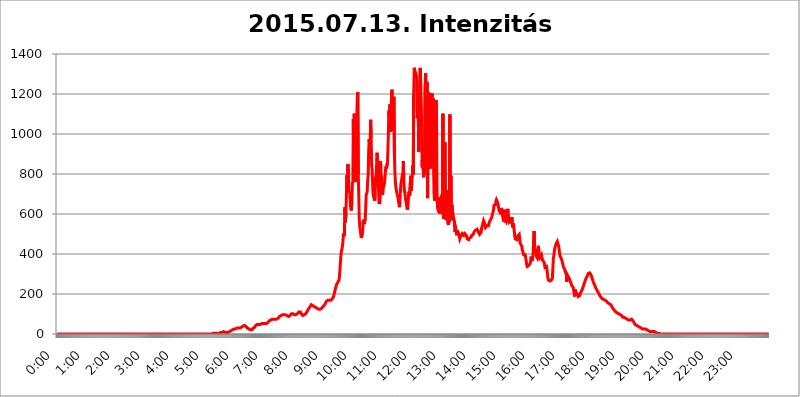
| Category | 2015.07.13. Intenzitás [W/m^2] |
|---|---|
| 0.0 | 0 |
| 0.0006944444444444445 | 0 |
| 0.001388888888888889 | 0 |
| 0.0020833333333333333 | 0 |
| 0.002777777777777778 | 0 |
| 0.003472222222222222 | 0 |
| 0.004166666666666667 | 0 |
| 0.004861111111111111 | 0 |
| 0.005555555555555556 | 0 |
| 0.0062499999999999995 | 0 |
| 0.006944444444444444 | 0 |
| 0.007638888888888889 | 0 |
| 0.008333333333333333 | 0 |
| 0.009027777777777779 | 0 |
| 0.009722222222222222 | 0 |
| 0.010416666666666666 | 0 |
| 0.011111111111111112 | 0 |
| 0.011805555555555555 | 0 |
| 0.012499999999999999 | 0 |
| 0.013194444444444444 | 0 |
| 0.013888888888888888 | 0 |
| 0.014583333333333332 | 0 |
| 0.015277777777777777 | 0 |
| 0.015972222222222224 | 0 |
| 0.016666666666666666 | 0 |
| 0.017361111111111112 | 0 |
| 0.018055555555555557 | 0 |
| 0.01875 | 0 |
| 0.019444444444444445 | 0 |
| 0.02013888888888889 | 0 |
| 0.020833333333333332 | 0 |
| 0.02152777777777778 | 0 |
| 0.022222222222222223 | 0 |
| 0.02291666666666667 | 0 |
| 0.02361111111111111 | 0 |
| 0.024305555555555556 | 0 |
| 0.024999999999999998 | 0 |
| 0.025694444444444447 | 0 |
| 0.02638888888888889 | 0 |
| 0.027083333333333334 | 0 |
| 0.027777777777777776 | 0 |
| 0.02847222222222222 | 0 |
| 0.029166666666666664 | 0 |
| 0.029861111111111113 | 0 |
| 0.030555555555555555 | 0 |
| 0.03125 | 0 |
| 0.03194444444444445 | 0 |
| 0.03263888888888889 | 0 |
| 0.03333333333333333 | 0 |
| 0.034027777777777775 | 0 |
| 0.034722222222222224 | 0 |
| 0.035416666666666666 | 0 |
| 0.036111111111111115 | 0 |
| 0.03680555555555556 | 0 |
| 0.0375 | 0 |
| 0.03819444444444444 | 0 |
| 0.03888888888888889 | 0 |
| 0.03958333333333333 | 0 |
| 0.04027777777777778 | 0 |
| 0.04097222222222222 | 0 |
| 0.041666666666666664 | 0 |
| 0.042361111111111106 | 0 |
| 0.04305555555555556 | 0 |
| 0.043750000000000004 | 0 |
| 0.044444444444444446 | 0 |
| 0.04513888888888889 | 0 |
| 0.04583333333333334 | 0 |
| 0.04652777777777778 | 0 |
| 0.04722222222222222 | 0 |
| 0.04791666666666666 | 0 |
| 0.04861111111111111 | 0 |
| 0.049305555555555554 | 0 |
| 0.049999999999999996 | 0 |
| 0.05069444444444445 | 0 |
| 0.051388888888888894 | 0 |
| 0.052083333333333336 | 0 |
| 0.05277777777777778 | 0 |
| 0.05347222222222222 | 0 |
| 0.05416666666666667 | 0 |
| 0.05486111111111111 | 0 |
| 0.05555555555555555 | 0 |
| 0.05625 | 0 |
| 0.05694444444444444 | 0 |
| 0.057638888888888885 | 0 |
| 0.05833333333333333 | 0 |
| 0.05902777777777778 | 0 |
| 0.059722222222222225 | 0 |
| 0.06041666666666667 | 0 |
| 0.061111111111111116 | 0 |
| 0.06180555555555556 | 0 |
| 0.0625 | 0 |
| 0.06319444444444444 | 0 |
| 0.06388888888888888 | 0 |
| 0.06458333333333334 | 0 |
| 0.06527777777777778 | 0 |
| 0.06597222222222222 | 0 |
| 0.06666666666666667 | 0 |
| 0.06736111111111111 | 0 |
| 0.06805555555555555 | 0 |
| 0.06874999999999999 | 0 |
| 0.06944444444444443 | 0 |
| 0.07013888888888889 | 0 |
| 0.07083333333333333 | 0 |
| 0.07152777777777779 | 0 |
| 0.07222222222222223 | 0 |
| 0.07291666666666667 | 0 |
| 0.07361111111111111 | 0 |
| 0.07430555555555556 | 0 |
| 0.075 | 0 |
| 0.07569444444444444 | 0 |
| 0.0763888888888889 | 0 |
| 0.07708333333333334 | 0 |
| 0.07777777777777778 | 0 |
| 0.07847222222222222 | 0 |
| 0.07916666666666666 | 0 |
| 0.0798611111111111 | 0 |
| 0.08055555555555556 | 0 |
| 0.08125 | 0 |
| 0.08194444444444444 | 0 |
| 0.08263888888888889 | 0 |
| 0.08333333333333333 | 0 |
| 0.08402777777777777 | 0 |
| 0.08472222222222221 | 0 |
| 0.08541666666666665 | 0 |
| 0.08611111111111112 | 0 |
| 0.08680555555555557 | 0 |
| 0.08750000000000001 | 0 |
| 0.08819444444444445 | 0 |
| 0.08888888888888889 | 0 |
| 0.08958333333333333 | 0 |
| 0.09027777777777778 | 0 |
| 0.09097222222222222 | 0 |
| 0.09166666666666667 | 0 |
| 0.09236111111111112 | 0 |
| 0.09305555555555556 | 0 |
| 0.09375 | 0 |
| 0.09444444444444444 | 0 |
| 0.09513888888888888 | 0 |
| 0.09583333333333333 | 0 |
| 0.09652777777777777 | 0 |
| 0.09722222222222222 | 0 |
| 0.09791666666666667 | 0 |
| 0.09861111111111111 | 0 |
| 0.09930555555555555 | 0 |
| 0.09999999999999999 | 0 |
| 0.10069444444444443 | 0 |
| 0.1013888888888889 | 0 |
| 0.10208333333333335 | 0 |
| 0.10277777777777779 | 0 |
| 0.10347222222222223 | 0 |
| 0.10416666666666667 | 0 |
| 0.10486111111111111 | 0 |
| 0.10555555555555556 | 0 |
| 0.10625 | 0 |
| 0.10694444444444444 | 0 |
| 0.1076388888888889 | 0 |
| 0.10833333333333334 | 0 |
| 0.10902777777777778 | 0 |
| 0.10972222222222222 | 0 |
| 0.1111111111111111 | 0 |
| 0.11180555555555556 | 0 |
| 0.11180555555555556 | 0 |
| 0.1125 | 0 |
| 0.11319444444444444 | 0 |
| 0.11388888888888889 | 0 |
| 0.11458333333333333 | 0 |
| 0.11527777777777777 | 0 |
| 0.11597222222222221 | 0 |
| 0.11666666666666665 | 0 |
| 0.1173611111111111 | 0 |
| 0.11805555555555557 | 0 |
| 0.11944444444444445 | 0 |
| 0.12013888888888889 | 0 |
| 0.12083333333333333 | 0 |
| 0.12152777777777778 | 0 |
| 0.12222222222222223 | 0 |
| 0.12291666666666667 | 0 |
| 0.12291666666666667 | 0 |
| 0.12361111111111112 | 0 |
| 0.12430555555555556 | 0 |
| 0.125 | 0 |
| 0.12569444444444444 | 0 |
| 0.12638888888888888 | 0 |
| 0.12708333333333333 | 0 |
| 0.16875 | 0 |
| 0.12847222222222224 | 0 |
| 0.12916666666666668 | 0 |
| 0.12986111111111112 | 0 |
| 0.13055555555555556 | 0 |
| 0.13125 | 0 |
| 0.13194444444444445 | 0 |
| 0.1326388888888889 | 0 |
| 0.13333333333333333 | 0 |
| 0.13402777777777777 | 0 |
| 0.13402777777777777 | 0 |
| 0.13472222222222222 | 0 |
| 0.13541666666666666 | 0 |
| 0.1361111111111111 | 0 |
| 0.13749999999999998 | 0 |
| 0.13819444444444443 | 0 |
| 0.1388888888888889 | 0 |
| 0.13958333333333334 | 0 |
| 0.14027777777777778 | 0 |
| 0.14097222222222222 | 0 |
| 0.14166666666666666 | 0 |
| 0.1423611111111111 | 0 |
| 0.14305555555555557 | 0 |
| 0.14375000000000002 | 0 |
| 0.14444444444444446 | 0 |
| 0.1451388888888889 | 0 |
| 0.1451388888888889 | 0 |
| 0.14652777777777778 | 0 |
| 0.14722222222222223 | 0 |
| 0.14791666666666667 | 0 |
| 0.1486111111111111 | 0 |
| 0.14930555555555555 | 0 |
| 0.15 | 0 |
| 0.15069444444444444 | 0 |
| 0.15138888888888888 | 0 |
| 0.15208333333333332 | 0 |
| 0.15277777777777776 | 0 |
| 0.15347222222222223 | 0 |
| 0.15416666666666667 | 0 |
| 0.15486111111111112 | 0 |
| 0.15555555555555556 | 0 |
| 0.15625 | 0 |
| 0.15694444444444444 | 0 |
| 0.15763888888888888 | 0 |
| 0.15833333333333333 | 0 |
| 0.15902777777777777 | 0 |
| 0.15972222222222224 | 0 |
| 0.16041666666666668 | 0 |
| 0.16111111111111112 | 0 |
| 0.16180555555555556 | 0 |
| 0.1625 | 0 |
| 0.16319444444444445 | 0 |
| 0.1638888888888889 | 0 |
| 0.16458333333333333 | 0 |
| 0.16527777777777777 | 0 |
| 0.16597222222222222 | 0 |
| 0.16666666666666666 | 0 |
| 0.1673611111111111 | 0 |
| 0.16805555555555554 | 0 |
| 0.16874999999999998 | 0 |
| 0.16944444444444443 | 0 |
| 0.17013888888888887 | 0 |
| 0.1708333333333333 | 0 |
| 0.17152777777777775 | 0 |
| 0.17222222222222225 | 0 |
| 0.1729166666666667 | 0 |
| 0.17361111111111113 | 0 |
| 0.17430555555555557 | 0 |
| 0.17500000000000002 | 0 |
| 0.17569444444444446 | 0 |
| 0.1763888888888889 | 0 |
| 0.17708333333333334 | 0 |
| 0.17777777777777778 | 0 |
| 0.17847222222222223 | 0 |
| 0.17916666666666667 | 0 |
| 0.1798611111111111 | 0 |
| 0.18055555555555555 | 0 |
| 0.18125 | 0 |
| 0.18194444444444444 | 0 |
| 0.1826388888888889 | 0 |
| 0.18333333333333335 | 0 |
| 0.1840277777777778 | 0 |
| 0.18472222222222223 | 0 |
| 0.18541666666666667 | 0 |
| 0.18611111111111112 | 0 |
| 0.18680555555555556 | 0 |
| 0.1875 | 0 |
| 0.18819444444444444 | 0 |
| 0.18888888888888888 | 0 |
| 0.18958333333333333 | 0 |
| 0.19027777777777777 | 0 |
| 0.1909722222222222 | 0 |
| 0.19166666666666665 | 0 |
| 0.19236111111111112 | 0 |
| 0.19305555555555554 | 0 |
| 0.19375 | 0 |
| 0.19444444444444445 | 0 |
| 0.1951388888888889 | 0 |
| 0.19583333333333333 | 0 |
| 0.19652777777777777 | 0 |
| 0.19722222222222222 | 0 |
| 0.19791666666666666 | 0 |
| 0.1986111111111111 | 0 |
| 0.19930555555555554 | 0 |
| 0.19999999999999998 | 0 |
| 0.20069444444444443 | 0 |
| 0.20138888888888887 | 0 |
| 0.2020833333333333 | 0 |
| 0.2027777777777778 | 0 |
| 0.2034722222222222 | 0 |
| 0.2041666666666667 | 0 |
| 0.20486111111111113 | 0 |
| 0.20555555555555557 | 0 |
| 0.20625000000000002 | 0 |
| 0.20694444444444446 | 0 |
| 0.2076388888888889 | 0 |
| 0.20833333333333334 | 0 |
| 0.20902777777777778 | 0 |
| 0.20972222222222223 | 0 |
| 0.21041666666666667 | 0 |
| 0.2111111111111111 | 0 |
| 0.21180555555555555 | 0 |
| 0.2125 | 0 |
| 0.21319444444444444 | 0 |
| 0.2138888888888889 | 0 |
| 0.21458333333333335 | 0 |
| 0.2152777777777778 | 0 |
| 0.21597222222222223 | 0 |
| 0.21666666666666667 | 0 |
| 0.21736111111111112 | 0 |
| 0.21805555555555556 | 0 |
| 0.21875 | 3.525 |
| 0.21944444444444444 | 3.525 |
| 0.22013888888888888 | 3.525 |
| 0.22083333333333333 | 3.525 |
| 0.22152777777777777 | 3.525 |
| 0.2222222222222222 | 3.525 |
| 0.22291666666666665 | 3.525 |
| 0.2236111111111111 | 3.525 |
| 0.22430555555555556 | 3.525 |
| 0.225 | 3.525 |
| 0.22569444444444445 | 3.525 |
| 0.2263888888888889 | 3.525 |
| 0.22708333333333333 | 3.525 |
| 0.22777777777777777 | 3.525 |
| 0.22847222222222222 | 3.525 |
| 0.22916666666666666 | 7.887 |
| 0.2298611111111111 | 7.887 |
| 0.23055555555555554 | 7.887 |
| 0.23124999999999998 | 7.887 |
| 0.23194444444444443 | 12.257 |
| 0.23263888888888887 | 12.257 |
| 0.2333333333333333 | 12.257 |
| 0.2340277777777778 | 12.257 |
| 0.2347222222222222 | 12.257 |
| 0.2354166666666667 | 7.887 |
| 0.23611111111111113 | 7.887 |
| 0.23680555555555557 | 7.887 |
| 0.23750000000000002 | 7.887 |
| 0.23819444444444446 | 7.887 |
| 0.2388888888888889 | 7.887 |
| 0.23958333333333334 | 7.887 |
| 0.24027777777777778 | 12.257 |
| 0.24097222222222223 | 12.257 |
| 0.24166666666666667 | 12.257 |
| 0.2423611111111111 | 12.257 |
| 0.24305555555555555 | 16.636 |
| 0.24375 | 16.636 |
| 0.24444444444444446 | 16.636 |
| 0.24513888888888888 | 21.024 |
| 0.24583333333333335 | 21.024 |
| 0.2465277777777778 | 21.024 |
| 0.24722222222222223 | 21.024 |
| 0.24791666666666667 | 25.419 |
| 0.24861111111111112 | 25.419 |
| 0.24930555555555556 | 25.419 |
| 0.25 | 25.419 |
| 0.25069444444444444 | 29.823 |
| 0.2513888888888889 | 29.823 |
| 0.2520833333333333 | 29.823 |
| 0.25277777777777777 | 29.823 |
| 0.2534722222222222 | 29.823 |
| 0.25416666666666665 | 29.823 |
| 0.2548611111111111 | 29.823 |
| 0.2555555555555556 | 29.823 |
| 0.25625000000000003 | 29.823 |
| 0.2569444444444445 | 29.823 |
| 0.2576388888888889 | 34.234 |
| 0.25833333333333336 | 34.234 |
| 0.2590277777777778 | 34.234 |
| 0.25972222222222224 | 38.653 |
| 0.2604166666666667 | 38.653 |
| 0.2611111111111111 | 43.079 |
| 0.26180555555555557 | 43.079 |
| 0.2625 | 43.079 |
| 0.26319444444444445 | 43.079 |
| 0.2638888888888889 | 38.653 |
| 0.26458333333333334 | 38.653 |
| 0.2652777777777778 | 38.653 |
| 0.2659722222222222 | 34.234 |
| 0.26666666666666666 | 29.823 |
| 0.2673611111111111 | 29.823 |
| 0.26805555555555555 | 25.419 |
| 0.26875 | 25.419 |
| 0.26944444444444443 | 21.024 |
| 0.2701388888888889 | 21.024 |
| 0.2708333333333333 | 21.024 |
| 0.27152777777777776 | 21.024 |
| 0.2722222222222222 | 21.024 |
| 0.27291666666666664 | 21.024 |
| 0.2736111111111111 | 21.024 |
| 0.2743055555555555 | 25.419 |
| 0.27499999999999997 | 29.823 |
| 0.27569444444444446 | 29.823 |
| 0.27638888888888885 | 34.234 |
| 0.27708333333333335 | 34.234 |
| 0.2777777777777778 | 38.653 |
| 0.27847222222222223 | 43.079 |
| 0.2791666666666667 | 43.079 |
| 0.2798611111111111 | 43.079 |
| 0.28055555555555556 | 47.511 |
| 0.28125 | 47.511 |
| 0.28194444444444444 | 47.511 |
| 0.2826388888888889 | 47.511 |
| 0.2833333333333333 | 47.511 |
| 0.28402777777777777 | 47.511 |
| 0.2847222222222222 | 47.511 |
| 0.28541666666666665 | 47.511 |
| 0.28611111111111115 | 51.951 |
| 0.28680555555555554 | 51.951 |
| 0.28750000000000003 | 51.951 |
| 0.2881944444444445 | 51.951 |
| 0.2888888888888889 | 51.951 |
| 0.28958333333333336 | 51.951 |
| 0.2902777777777778 | 47.511 |
| 0.29097222222222224 | 51.951 |
| 0.2916666666666667 | 47.511 |
| 0.2923611111111111 | 47.511 |
| 0.29305555555555557 | 51.951 |
| 0.29375 | 51.951 |
| 0.29444444444444445 | 56.398 |
| 0.2951388888888889 | 56.398 |
| 0.29583333333333334 | 60.85 |
| 0.2965277777777778 | 60.85 |
| 0.2972222222222222 | 65.31 |
| 0.29791666666666666 | 65.31 |
| 0.2986111111111111 | 65.31 |
| 0.29930555555555555 | 69.775 |
| 0.3 | 69.775 |
| 0.30069444444444443 | 69.775 |
| 0.3013888888888889 | 74.246 |
| 0.3020833333333333 | 74.246 |
| 0.30277777777777776 | 74.246 |
| 0.3034722222222222 | 74.246 |
| 0.30416666666666664 | 74.246 |
| 0.3048611111111111 | 74.246 |
| 0.3055555555555555 | 74.246 |
| 0.30624999999999997 | 74.246 |
| 0.3069444444444444 | 74.246 |
| 0.3076388888888889 | 74.246 |
| 0.30833333333333335 | 74.246 |
| 0.3090277777777778 | 74.246 |
| 0.30972222222222223 | 78.722 |
| 0.3104166666666667 | 78.722 |
| 0.3111111111111111 | 83.205 |
| 0.31180555555555556 | 87.692 |
| 0.3125 | 87.692 |
| 0.31319444444444444 | 92.184 |
| 0.3138888888888889 | 92.184 |
| 0.3145833333333333 | 96.682 |
| 0.31527777777777777 | 96.682 |
| 0.3159722222222222 | 96.682 |
| 0.31666666666666665 | 96.682 |
| 0.31736111111111115 | 96.682 |
| 0.31805555555555554 | 96.682 |
| 0.31875000000000003 | 96.682 |
| 0.3194444444444445 | 96.682 |
| 0.3201388888888889 | 96.682 |
| 0.32083333333333336 | 96.682 |
| 0.3215277777777778 | 92.184 |
| 0.32222222222222224 | 92.184 |
| 0.3229166666666667 | 92.184 |
| 0.3236111111111111 | 87.692 |
| 0.32430555555555557 | 87.692 |
| 0.325 | 87.692 |
| 0.32569444444444445 | 92.184 |
| 0.3263888888888889 | 92.184 |
| 0.32708333333333334 | 96.682 |
| 0.3277777777777778 | 96.682 |
| 0.3284722222222222 | 101.184 |
| 0.32916666666666666 | 101.184 |
| 0.3298611111111111 | 101.184 |
| 0.33055555555555555 | 101.184 |
| 0.33125 | 101.184 |
| 0.33194444444444443 | 101.184 |
| 0.3326388888888889 | 96.682 |
| 0.3333333333333333 | 96.682 |
| 0.3340277777777778 | 96.682 |
| 0.3347222222222222 | 96.682 |
| 0.3354166666666667 | 96.682 |
| 0.3361111111111111 | 101.184 |
| 0.3368055555555556 | 101.184 |
| 0.33749999999999997 | 105.69 |
| 0.33819444444444446 | 105.69 |
| 0.33888888888888885 | 110.201 |
| 0.33958333333333335 | 110.201 |
| 0.34027777777777773 | 110.201 |
| 0.34097222222222223 | 110.201 |
| 0.3416666666666666 | 105.69 |
| 0.3423611111111111 | 101.184 |
| 0.3430555555555555 | 96.682 |
| 0.34375 | 96.682 |
| 0.3444444444444445 | 92.184 |
| 0.3451388888888889 | 92.184 |
| 0.3458333333333334 | 92.184 |
| 0.34652777777777777 | 96.682 |
| 0.34722222222222227 | 96.682 |
| 0.34791666666666665 | 96.682 |
| 0.34861111111111115 | 101.184 |
| 0.34930555555555554 | 101.184 |
| 0.35000000000000003 | 110.201 |
| 0.3506944444444444 | 110.201 |
| 0.3513888888888889 | 119.235 |
| 0.3520833333333333 | 123.758 |
| 0.3527777777777778 | 128.284 |
| 0.3534722222222222 | 128.284 |
| 0.3541666666666667 | 132.814 |
| 0.3548611111111111 | 137.347 |
| 0.35555555555555557 | 141.884 |
| 0.35625 | 146.423 |
| 0.35694444444444445 | 150.964 |
| 0.3576388888888889 | 146.423 |
| 0.35833333333333334 | 141.884 |
| 0.3590277777777778 | 137.347 |
| 0.3597222222222222 | 137.347 |
| 0.36041666666666666 | 137.347 |
| 0.3611111111111111 | 137.347 |
| 0.36180555555555555 | 137.347 |
| 0.3625 | 132.814 |
| 0.36319444444444443 | 132.814 |
| 0.3638888888888889 | 128.284 |
| 0.3645833333333333 | 128.284 |
| 0.3652777777777778 | 123.758 |
| 0.3659722222222222 | 123.758 |
| 0.3666666666666667 | 123.758 |
| 0.3673611111111111 | 123.758 |
| 0.3680555555555556 | 123.758 |
| 0.36874999999999997 | 123.758 |
| 0.36944444444444446 | 123.758 |
| 0.37013888888888885 | 128.284 |
| 0.37083333333333335 | 128.284 |
| 0.37152777777777773 | 128.284 |
| 0.37222222222222223 | 132.814 |
| 0.3729166666666666 | 137.347 |
| 0.3736111111111111 | 137.347 |
| 0.3743055555555555 | 141.884 |
| 0.375 | 146.423 |
| 0.3756944444444445 | 150.964 |
| 0.3763888888888889 | 155.509 |
| 0.3770833333333334 | 160.056 |
| 0.37777777777777777 | 164.605 |
| 0.37847222222222227 | 164.605 |
| 0.37916666666666665 | 164.605 |
| 0.37986111111111115 | 169.156 |
| 0.38055555555555554 | 169.156 |
| 0.38125000000000003 | 169.156 |
| 0.3819444444444444 | 169.156 |
| 0.3826388888888889 | 169.156 |
| 0.3833333333333333 | 169.156 |
| 0.3840277777777778 | 169.156 |
| 0.3847222222222222 | 173.709 |
| 0.3854166666666667 | 173.709 |
| 0.3861111111111111 | 178.264 |
| 0.38680555555555557 | 182.82 |
| 0.3875 | 187.378 |
| 0.38819444444444445 | 196.497 |
| 0.3888888888888889 | 205.62 |
| 0.38958333333333334 | 219.309 |
| 0.3902777777777778 | 228.436 |
| 0.3909722222222222 | 237.564 |
| 0.39166666666666666 | 246.689 |
| 0.3923611111111111 | 251.251 |
| 0.39305555555555555 | 255.813 |
| 0.39375 | 260.373 |
| 0.39444444444444443 | 260.373 |
| 0.3951388888888889 | 269.49 |
| 0.3958333333333333 | 287.709 |
| 0.3965277777777778 | 324.052 |
| 0.3972222222222222 | 360.221 |
| 0.3979166666666667 | 396.164 |
| 0.3986111111111111 | 414.035 |
| 0.3993055555555556 | 422.943 |
| 0.39999999999999997 | 440.702 |
| 0.40069444444444446 | 462.786 |
| 0.40138888888888885 | 502.192 |
| 0.40208333333333335 | 489.108 |
| 0.40277777777777773 | 506.542 |
| 0.40347222222222223 | 634.105 |
| 0.4041666666666666 | 558.261 |
| 0.4048611111111111 | 604.864 |
| 0.4055555555555555 | 691.608 |
| 0.40625 | 795.074 |
| 0.4069444444444445 | 723.889 |
| 0.4076388888888889 | 849.199 |
| 0.4083333333333334 | 798.974 |
| 0.40902777777777777 | 723.889 |
| 0.40972222222222227 | 711.832 |
| 0.41041666666666665 | 703.762 |
| 0.41111111111111115 | 646.537 |
| 0.41180555555555554 | 625.784 |
| 0.41250000000000003 | 617.436 |
| 0.4131944444444444 | 658.909 |
| 0.4138888888888889 | 751.803 |
| 0.4145833333333333 | 759.723 |
| 0.4152777777777778 | 1074.789 |
| 0.4159722222222222 | 818.392 |
| 0.4166666666666667 | 1101.226 |
| 0.4173611111111111 | 887.309 |
| 0.41805555555555557 | 783.342 |
| 0.41875 | 759.723 |
| 0.41944444444444445 | 837.682 |
| 0.4201388888888889 | 1086.097 |
| 0.42083333333333334 | 1186.03 |
| 0.4215277777777778 | 1209.807 |
| 0.4222222222222222 | 798.974 |
| 0.42291666666666666 | 687.544 |
| 0.4236111111111111 | 571.049 |
| 0.42430555555555555 | 536.82 |
| 0.425 | 519.555 |
| 0.42569444444444443 | 497.836 |
| 0.4263888888888889 | 480.356 |
| 0.4270833333333333 | 484.735 |
| 0.4277777777777778 | 497.836 |
| 0.4284722222222222 | 519.555 |
| 0.4291666666666667 | 571.049 |
| 0.4298611111111111 | 566.793 |
| 0.4305555555555556 | 549.704 |
| 0.43124999999999997 | 549.704 |
| 0.43194444444444446 | 575.299 |
| 0.43263888888888885 | 629.948 |
| 0.43333333333333335 | 695.666 |
| 0.43402777777777773 | 691.608 |
| 0.43472222222222223 | 711.832 |
| 0.4354166666666666 | 771.559 |
| 0.4361111111111111 | 791.169 |
| 0.4368055555555555 | 917.534 |
| 0.4375 | 973.772 |
| 0.4381944444444445 | 940.082 |
| 0.4388888888888889 | 962.555 |
| 0.4395833333333334 | 1071.027 |
| 0.44027777777777777 | 981.244 |
| 0.44097222222222227 | 841.526 |
| 0.44166666666666665 | 826.123 |
| 0.44236111111111115 | 747.834 |
| 0.44305555555555554 | 695.666 |
| 0.44375000000000003 | 699.717 |
| 0.4444444444444444 | 699.717 |
| 0.4451388888888889 | 667.123 |
| 0.4458333333333333 | 687.544 |
| 0.4465277777777778 | 783.342 |
| 0.4472222222222222 | 791.169 |
| 0.4479166666666667 | 845.365 |
| 0.4486111111111111 | 906.223 |
| 0.44930555555555557 | 822.26 |
| 0.45 | 763.674 |
| 0.45069444444444445 | 719.877 |
| 0.4513888888888889 | 650.667 |
| 0.45208333333333334 | 650.667 |
| 0.4527777777777778 | 663.019 |
| 0.4534722222222222 | 864.493 |
| 0.45416666666666666 | 735.89 |
| 0.4548611111111111 | 795.074 |
| 0.45555555555555555 | 711.832 |
| 0.45625 | 695.666 |
| 0.45694444444444443 | 723.889 |
| 0.4576388888888889 | 735.89 |
| 0.4583333333333333 | 739.877 |
| 0.4590277777777778 | 751.803 |
| 0.4597222222222222 | 783.342 |
| 0.4604166666666667 | 822.26 |
| 0.4611111111111111 | 837.682 |
| 0.4618055555555556 | 826.123 |
| 0.46249999999999997 | 829.981 |
| 0.46319444444444446 | 860.676 |
| 0.46388888888888885 | 928.819 |
| 0.46458333333333335 | 1022.323 |
| 0.46527777777777773 | 1116.426 |
| 0.46597222222222223 | 1029.798 |
| 0.4666666666666666 | 1147.086 |
| 0.4673611111111111 | 1011.118 |
| 0.4680555555555555 | 1078.555 |
| 0.46875 | 1178.177 |
| 0.4694444444444445 | 1221.83 |
| 0.4701388888888889 | 1074.789 |
| 0.4708333333333334 | 1014.852 |
| 0.47152777777777777 | 1120.238 |
| 0.47222222222222227 | 1186.03 |
| 0.47291666666666665 | 894.885 |
| 0.47361111111111115 | 802.868 |
| 0.47430555555555554 | 759.723 |
| 0.47500000000000003 | 731.896 |
| 0.4756944444444444 | 727.896 |
| 0.4763888888888889 | 703.762 |
| 0.4770833333333333 | 699.717 |
| 0.4777777777777778 | 683.473 |
| 0.4784722222222222 | 667.123 |
| 0.4791666666666667 | 650.667 |
| 0.4798611111111111 | 634.105 |
| 0.48055555555555557 | 654.791 |
| 0.48125 | 707.8 |
| 0.48194444444444445 | 747.834 |
| 0.4826388888888889 | 751.803 |
| 0.48333333333333334 | 751.803 |
| 0.4840277777777778 | 795.074 |
| 0.4847222222222222 | 802.868 |
| 0.48541666666666666 | 864.493 |
| 0.4861111111111111 | 759.723 |
| 0.48680555555555555 | 719.877 |
| 0.4875 | 707.8 |
| 0.48819444444444443 | 683.473 |
| 0.4888888888888889 | 667.123 |
| 0.4895833333333333 | 654.791 |
| 0.4902777777777778 | 634.105 |
| 0.4909722222222222 | 621.613 |
| 0.4916666666666667 | 629.948 |
| 0.4923611111111111 | 667.123 |
| 0.4930555555555556 | 711.832 |
| 0.49374999999999997 | 707.8 |
| 0.49444444444444446 | 691.608 |
| 0.49513888888888885 | 751.803 |
| 0.49583333333333335 | 791.169 |
| 0.49652777777777773 | 715.858 |
| 0.49722222222222223 | 755.766 |
| 0.4979166666666666 | 783.342 |
| 0.4986111111111111 | 841.526 |
| 0.4993055555555555 | 795.074 |
| 0.5 | 1201.843 |
| 0.5006944444444444 | 1330.826 |
| 0.5013888888888889 | 1317.736 |
| 0.5020833333333333 | 1322.082 |
| 0.5027777777777778 | 1304.795 |
| 0.5034722222222222 | 1296.248 |
| 0.5041666666666667 | 1270.964 |
| 0.5048611111111111 | 1078.555 |
| 0.5055555555555555 | 1124.056 |
| 0.50625 | 1182.099 |
| 0.5069444444444444 | 909.996 |
| 0.5076388888888889 | 932.576 |
| 0.5083333333333333 | 1254.387 |
| 0.5090277777777777 | 1330.826 |
| 0.5097222222222222 | 1254.387 |
| 0.5104166666666666 | 1162.571 |
| 0.5111111111111112 | 1048.508 |
| 0.5118055555555555 | 833.834 |
| 0.5125000000000001 | 913.766 |
| 0.5131944444444444 | 822.26 |
| 0.513888888888889 | 783.342 |
| 0.5145833333333333 | 951.327 |
| 0.5152777777777778 | 798.974 |
| 0.5159722222222222 | 1242.089 |
| 0.5166666666666667 | 1304.795 |
| 0.517361111111111 | 1229.899 |
| 0.5180555555555556 | 977.508 |
| 0.5187499999999999 | 1258.511 |
| 0.5194444444444445 | 679.395 |
| 0.5201388888888888 | 1158.689 |
| 0.5208333333333334 | 1209.807 |
| 0.5215277777777778 | 1011.118 |
| 0.5222222222222223 | 917.534 |
| 0.5229166666666667 | 826.123 |
| 0.5236111111111111 | 1201.843 |
| 0.5243055555555556 | 853.029 |
| 0.525 | 868.305 |
| 0.5256944444444445 | 1201.843 |
| 0.5263888888888889 | 833.834 |
| 0.5270833333333333 | 1178.177 |
| 0.5277777777777778 | 845.365 |
| 0.5284722222222222 | 707.8 |
| 0.5291666666666667 | 667.123 |
| 0.5298611111111111 | 675.311 |
| 0.5305555555555556 | 707.8 |
| 0.53125 | 1170.358 |
| 0.5319444444444444 | 1089.873 |
| 0.5326388888888889 | 719.877 |
| 0.5333333333333333 | 634.105 |
| 0.5340277777777778 | 638.256 |
| 0.5347222222222222 | 609.062 |
| 0.5354166666666667 | 683.473 |
| 0.5361111111111111 | 617.436 |
| 0.5368055555555555 | 600.661 |
| 0.5375 | 609.062 |
| 0.5381944444444444 | 625.784 |
| 0.5388888888888889 | 687.544 |
| 0.5395833333333333 | 695.666 |
| 0.5402777777777777 | 687.544 |
| 0.5409722222222222 | 1101.226 |
| 0.5416666666666666 | 575.299 |
| 0.5423611111111112 | 575.299 |
| 0.5430555555555555 | 625.784 |
| 0.5437500000000001 | 958.814 |
| 0.5444444444444444 | 658.909 |
| 0.545138888888889 | 571.049 |
| 0.5458333333333333 | 592.233 |
| 0.5465277777777778 | 575.299 |
| 0.5472222222222222 | 719.877 |
| 0.5479166666666667 | 553.986 |
| 0.548611111111111 | 545.416 |
| 0.5493055555555556 | 579.542 |
| 0.5499999999999999 | 558.261 |
| 0.5506944444444445 | 1097.437 |
| 0.5513888888888888 | 588.009 |
| 0.5520833333333334 | 791.169 |
| 0.5527777777777778 | 571.049 |
| 0.5534722222222223 | 646.537 |
| 0.5541666666666667 | 617.436 |
| 0.5548611111111111 | 604.864 |
| 0.5555555555555556 | 566.793 |
| 0.55625 | 575.299 |
| 0.5569444444444445 | 566.793 |
| 0.5576388888888889 | 510.885 |
| 0.5583333333333333 | 506.542 |
| 0.5590277777777778 | 523.88 |
| 0.5597222222222222 | 523.88 |
| 0.5604166666666667 | 493.475 |
| 0.5611111111111111 | 519.555 |
| 0.5618055555555556 | 510.885 |
| 0.5625 | 510.885 |
| 0.5631944444444444 | 502.192 |
| 0.5638888888888889 | 489.108 |
| 0.5645833333333333 | 475.972 |
| 0.5652777777777778 | 480.356 |
| 0.5659722222222222 | 489.108 |
| 0.5666666666666667 | 489.108 |
| 0.5673611111111111 | 493.475 |
| 0.5680555555555555 | 502.192 |
| 0.56875 | 502.192 |
| 0.5694444444444444 | 497.836 |
| 0.5701388888888889 | 493.475 |
| 0.5708333333333333 | 497.836 |
| 0.5715277777777777 | 502.192 |
| 0.5722222222222222 | 502.192 |
| 0.5729166666666666 | 502.192 |
| 0.5736111111111112 | 493.475 |
| 0.5743055555555555 | 484.735 |
| 0.5750000000000001 | 475.972 |
| 0.5756944444444444 | 475.972 |
| 0.576388888888889 | 471.582 |
| 0.5770833333333333 | 471.582 |
| 0.5777777777777778 | 475.972 |
| 0.5784722222222222 | 480.356 |
| 0.5791666666666667 | 480.356 |
| 0.579861111111111 | 480.356 |
| 0.5805555555555556 | 484.735 |
| 0.5812499999999999 | 493.475 |
| 0.5819444444444445 | 497.836 |
| 0.5826388888888888 | 497.836 |
| 0.5833333333333334 | 497.836 |
| 0.5840277777777778 | 502.192 |
| 0.5847222222222223 | 510.885 |
| 0.5854166666666667 | 515.223 |
| 0.5861111111111111 | 515.223 |
| 0.5868055555555556 | 519.555 |
| 0.5875 | 523.88 |
| 0.5881944444444445 | 523.88 |
| 0.5888888888888889 | 523.88 |
| 0.5895833333333333 | 523.88 |
| 0.5902777777777778 | 515.223 |
| 0.5909722222222222 | 506.542 |
| 0.5916666666666667 | 502.192 |
| 0.5923611111111111 | 497.836 |
| 0.5930555555555556 | 497.836 |
| 0.59375 | 497.836 |
| 0.5944444444444444 | 506.542 |
| 0.5951388888888889 | 528.2 |
| 0.5958333333333333 | 536.82 |
| 0.5965277777777778 | 545.416 |
| 0.5972222222222222 | 558.261 |
| 0.5979166666666667 | 566.793 |
| 0.5986111111111111 | 566.793 |
| 0.5993055555555555 | 553.986 |
| 0.6 | 545.416 |
| 0.6006944444444444 | 532.513 |
| 0.6013888888888889 | 532.513 |
| 0.6020833333333333 | 536.82 |
| 0.6027777777777777 | 541.121 |
| 0.6034722222222222 | 541.121 |
| 0.6041666666666666 | 536.82 |
| 0.6048611111111112 | 541.121 |
| 0.6055555555555555 | 553.986 |
| 0.6062500000000001 | 558.261 |
| 0.6069444444444444 | 566.793 |
| 0.607638888888889 | 566.793 |
| 0.6083333333333333 | 566.793 |
| 0.6090277777777778 | 579.542 |
| 0.6097222222222222 | 588.009 |
| 0.6104166666666667 | 600.661 |
| 0.611111111111111 | 609.062 |
| 0.6118055555555556 | 617.436 |
| 0.6124999999999999 | 642.4 |
| 0.6131944444444445 | 638.256 |
| 0.6138888888888888 | 638.256 |
| 0.6145833333333334 | 646.537 |
| 0.6152777777777778 | 663.019 |
| 0.6159722222222223 | 671.22 |
| 0.6166666666666667 | 675.311 |
| 0.6173611111111111 | 675.311 |
| 0.6180555555555556 | 654.791 |
| 0.61875 | 638.256 |
| 0.6194444444444445 | 621.613 |
| 0.6201388888888889 | 609.062 |
| 0.6208333333333333 | 629.948 |
| 0.6215277777777778 | 609.062 |
| 0.6222222222222222 | 613.252 |
| 0.6229166666666667 | 604.864 |
| 0.6236111111111111 | 617.436 |
| 0.6243055555555556 | 596.45 |
| 0.625 | 583.779 |
| 0.6256944444444444 | 571.049 |
| 0.6263888888888889 | 562.53 |
| 0.6270833333333333 | 621.613 |
| 0.6277777777777778 | 575.299 |
| 0.6284722222222222 | 558.261 |
| 0.6291666666666667 | 575.299 |
| 0.6298611111111111 | 566.793 |
| 0.6305555555555555 | 575.299 |
| 0.63125 | 579.542 |
| 0.6319444444444444 | 625.784 |
| 0.6326388888888889 | 579.542 |
| 0.6333333333333333 | 562.53 |
| 0.6340277777777777 | 562.53 |
| 0.6347222222222222 | 571.049 |
| 0.6354166666666666 | 566.793 |
| 0.6361111111111112 | 571.049 |
| 0.6368055555555555 | 553.986 |
| 0.6375000000000001 | 583.779 |
| 0.6381944444444444 | 562.53 |
| 0.638888888888889 | 532.513 |
| 0.6395833333333333 | 553.986 |
| 0.6402777777777778 | 541.121 |
| 0.6409722222222222 | 515.223 |
| 0.6416666666666667 | 489.108 |
| 0.642361111111111 | 475.972 |
| 0.6430555555555556 | 475.972 |
| 0.6437499999999999 | 475.972 |
| 0.6444444444444445 | 471.582 |
| 0.6451388888888888 | 480.356 |
| 0.6458333333333334 | 489.108 |
| 0.6465277777777778 | 489.108 |
| 0.6472222222222223 | 489.108 |
| 0.6479166666666667 | 497.836 |
| 0.6486111111111111 | 475.972 |
| 0.6493055555555556 | 453.968 |
| 0.65 | 453.968 |
| 0.6506944444444445 | 453.968 |
| 0.6513888888888889 | 440.702 |
| 0.6520833333333333 | 422.943 |
| 0.6527777777777778 | 414.035 |
| 0.6534722222222222 | 405.108 |
| 0.6541666666666667 | 396.164 |
| 0.6548611111111111 | 396.164 |
| 0.6555555555555556 | 400.638 |
| 0.65625 | 396.164 |
| 0.6569444444444444 | 382.715 |
| 0.6576388888888889 | 369.23 |
| 0.6583333333333333 | 346.682 |
| 0.6590277777777778 | 337.639 |
| 0.6597222222222222 | 337.639 |
| 0.6604166666666667 | 337.639 |
| 0.6611111111111111 | 342.162 |
| 0.6618055555555555 | 342.162 |
| 0.6625 | 346.682 |
| 0.6631944444444444 | 351.198 |
| 0.6638888888888889 | 360.221 |
| 0.6645833333333333 | 387.202 |
| 0.6652777777777777 | 373.729 |
| 0.6659722222222222 | 364.728 |
| 0.6666666666666666 | 378.224 |
| 0.6673611111111111 | 396.164 |
| 0.6680555555555556 | 467.187 |
| 0.6687500000000001 | 515.223 |
| 0.6694444444444444 | 449.551 |
| 0.6701388888888888 | 431.833 |
| 0.6708333333333334 | 409.574 |
| 0.6715277777777778 | 396.164 |
| 0.6722222222222222 | 387.202 |
| 0.6729166666666666 | 387.202 |
| 0.6736111111111112 | 378.224 |
| 0.6743055555555556 | 387.202 |
| 0.6749999999999999 | 440.702 |
| 0.6756944444444444 | 378.224 |
| 0.6763888888888889 | 391.685 |
| 0.6770833333333334 | 382.715 |
| 0.6777777777777777 | 382.715 |
| 0.6784722222222223 | 382.715 |
| 0.6791666666666667 | 396.164 |
| 0.6798611111111111 | 382.715 |
| 0.6805555555555555 | 369.23 |
| 0.68125 | 369.23 |
| 0.6819444444444445 | 369.23 |
| 0.6826388888888889 | 360.221 |
| 0.6833333333333332 | 351.198 |
| 0.6840277777777778 | 333.113 |
| 0.6847222222222222 | 328.584 |
| 0.6854166666666667 | 337.639 |
| 0.686111111111111 | 337.639 |
| 0.6868055555555556 | 324.052 |
| 0.6875 | 301.354 |
| 0.6881944444444444 | 278.603 |
| 0.688888888888889 | 269.49 |
| 0.6895833333333333 | 264.932 |
| 0.6902777777777778 | 264.932 |
| 0.6909722222222222 | 264.932 |
| 0.6916666666666668 | 269.49 |
| 0.6923611111111111 | 269.49 |
| 0.6930555555555555 | 269.49 |
| 0.69375 | 274.047 |
| 0.6944444444444445 | 278.603 |
| 0.6951388888888889 | 328.584 |
| 0.6958333333333333 | 378.224 |
| 0.6965277777777777 | 391.685 |
| 0.6972222222222223 | 414.035 |
| 0.6979166666666666 | 431.833 |
| 0.6986111111111111 | 436.27 |
| 0.6993055555555556 | 445.129 |
| 0.7000000000000001 | 453.968 |
| 0.7006944444444444 | 458.38 |
| 0.7013888888888888 | 462.786 |
| 0.7020833333333334 | 462.786 |
| 0.7027777777777778 | 445.129 |
| 0.7034722222222222 | 436.27 |
| 0.7041666666666666 | 414.035 |
| 0.7048611111111112 | 396.164 |
| 0.7055555555555556 | 387.202 |
| 0.7062499999999999 | 382.715 |
| 0.7069444444444444 | 378.224 |
| 0.7076388888888889 | 369.23 |
| 0.7083333333333334 | 364.728 |
| 0.7090277777777777 | 351.198 |
| 0.7097222222222223 | 337.639 |
| 0.7104166666666667 | 333.113 |
| 0.7111111111111111 | 328.584 |
| 0.7118055555555555 | 324.052 |
| 0.7125 | 310.44 |
| 0.7131944444444445 | 305.898 |
| 0.7138888888888889 | 301.354 |
| 0.7145833333333332 | 260.373 |
| 0.7152777777777778 | 296.808 |
| 0.7159722222222222 | 296.808 |
| 0.7166666666666667 | 287.709 |
| 0.717361111111111 | 283.156 |
| 0.7180555555555556 | 278.603 |
| 0.71875 | 274.047 |
| 0.7194444444444444 | 264.932 |
| 0.720138888888889 | 260.373 |
| 0.7208333333333333 | 251.251 |
| 0.7215277777777778 | 242.127 |
| 0.7222222222222222 | 242.127 |
| 0.7229166666666668 | 242.127 |
| 0.7236111111111111 | 233 |
| 0.7243055555555555 | 233 |
| 0.725 | 233 |
| 0.7256944444444445 | 187.378 |
| 0.7263888888888889 | 223.873 |
| 0.7270833333333333 | 210.182 |
| 0.7277777777777777 | 205.62 |
| 0.7284722222222223 | 210.182 |
| 0.7291666666666666 | 201.058 |
| 0.7298611111111111 | 201.058 |
| 0.7305555555555556 | 187.378 |
| 0.7312500000000001 | 191.937 |
| 0.7319444444444444 | 191.937 |
| 0.7326388888888888 | 191.937 |
| 0.7333333333333334 | 191.937 |
| 0.7340277777777778 | 205.62 |
| 0.7347222222222222 | 205.62 |
| 0.7354166666666666 | 214.746 |
| 0.7361111111111112 | 219.309 |
| 0.7368055555555556 | 228.436 |
| 0.7374999999999999 | 233 |
| 0.7381944444444444 | 242.127 |
| 0.7388888888888889 | 251.251 |
| 0.7395833333333334 | 255.813 |
| 0.7402777777777777 | 264.932 |
| 0.7409722222222223 | 269.49 |
| 0.7416666666666667 | 278.603 |
| 0.7423611111111111 | 278.603 |
| 0.7430555555555555 | 283.156 |
| 0.74375 | 292.259 |
| 0.7444444444444445 | 301.354 |
| 0.7451388888888889 | 305.898 |
| 0.7458333333333332 | 305.898 |
| 0.7465277777777778 | 305.898 |
| 0.7472222222222222 | 301.354 |
| 0.7479166666666667 | 301.354 |
| 0.748611111111111 | 296.808 |
| 0.7493055555555556 | 287.709 |
| 0.75 | 283.156 |
| 0.7506944444444444 | 274.047 |
| 0.751388888888889 | 264.932 |
| 0.7520833333333333 | 260.373 |
| 0.7527777777777778 | 251.251 |
| 0.7534722222222222 | 246.689 |
| 0.7541666666666668 | 242.127 |
| 0.7548611111111111 | 233 |
| 0.7555555555555555 | 228.436 |
| 0.75625 | 223.873 |
| 0.7569444444444445 | 219.309 |
| 0.7576388888888889 | 214.746 |
| 0.7583333333333333 | 210.182 |
| 0.7590277777777777 | 205.62 |
| 0.7597222222222223 | 201.058 |
| 0.7604166666666666 | 196.497 |
| 0.7611111111111111 | 191.937 |
| 0.7618055555555556 | 187.378 |
| 0.7625000000000001 | 182.82 |
| 0.7631944444444444 | 182.82 |
| 0.7638888888888888 | 178.264 |
| 0.7645833333333334 | 178.264 |
| 0.7652777777777778 | 178.264 |
| 0.7659722222222222 | 173.709 |
| 0.7666666666666666 | 173.709 |
| 0.7673611111111112 | 173.709 |
| 0.7680555555555556 | 169.156 |
| 0.7687499999999999 | 169.156 |
| 0.7694444444444444 | 169.156 |
| 0.7701388888888889 | 164.605 |
| 0.7708333333333334 | 160.056 |
| 0.7715277777777777 | 160.056 |
| 0.7722222222222223 | 155.509 |
| 0.7729166666666667 | 155.509 |
| 0.7736111111111111 | 155.509 |
| 0.7743055555555555 | 150.964 |
| 0.775 | 150.964 |
| 0.7756944444444445 | 146.423 |
| 0.7763888888888889 | 146.423 |
| 0.7770833333333332 | 141.884 |
| 0.7777777777777778 | 137.347 |
| 0.7784722222222222 | 132.814 |
| 0.7791666666666667 | 128.284 |
| 0.779861111111111 | 128.284 |
| 0.7805555555555556 | 123.758 |
| 0.78125 | 119.235 |
| 0.7819444444444444 | 119.235 |
| 0.782638888888889 | 114.716 |
| 0.7833333333333333 | 110.201 |
| 0.7840277777777778 | 110.201 |
| 0.7847222222222222 | 105.69 |
| 0.7854166666666668 | 105.69 |
| 0.7861111111111111 | 101.184 |
| 0.7868055555555555 | 101.184 |
| 0.7875 | 101.184 |
| 0.7881944444444445 | 101.184 |
| 0.7888888888888889 | 96.682 |
| 0.7895833333333333 | 96.682 |
| 0.7902777777777777 | 96.682 |
| 0.7909722222222223 | 92.184 |
| 0.7916666666666666 | 92.184 |
| 0.7923611111111111 | 87.692 |
| 0.7930555555555556 | 83.205 |
| 0.7937500000000001 | 83.205 |
| 0.7944444444444444 | 83.205 |
| 0.7951388888888888 | 83.205 |
| 0.7958333333333334 | 78.722 |
| 0.7965277777777778 | 78.722 |
| 0.7972222222222222 | 78.722 |
| 0.7979166666666666 | 74.246 |
| 0.7986111111111112 | 74.246 |
| 0.7993055555555556 | 74.246 |
| 0.7999999999999999 | 74.246 |
| 0.8006944444444444 | 69.775 |
| 0.8013888888888889 | 69.775 |
| 0.8020833333333334 | 69.775 |
| 0.8027777777777777 | 69.775 |
| 0.8034722222222223 | 69.775 |
| 0.8041666666666667 | 69.775 |
| 0.8048611111111111 | 74.246 |
| 0.8055555555555555 | 74.246 |
| 0.80625 | 74.246 |
| 0.8069444444444445 | 69.775 |
| 0.8076388888888889 | 65.31 |
| 0.8083333333333332 | 60.85 |
| 0.8090277777777778 | 56.398 |
| 0.8097222222222222 | 51.951 |
| 0.8104166666666667 | 47.511 |
| 0.811111111111111 | 47.511 |
| 0.8118055555555556 | 43.079 |
| 0.8125 | 43.079 |
| 0.8131944444444444 | 43.079 |
| 0.813888888888889 | 38.653 |
| 0.8145833333333333 | 38.653 |
| 0.8152777777777778 | 38.653 |
| 0.8159722222222222 | 34.234 |
| 0.8166666666666668 | 34.234 |
| 0.8173611111111111 | 29.823 |
| 0.8180555555555555 | 29.823 |
| 0.81875 | 29.823 |
| 0.8194444444444445 | 29.823 |
| 0.8201388888888889 | 25.419 |
| 0.8208333333333333 | 25.419 |
| 0.8215277777777777 | 25.419 |
| 0.8222222222222223 | 25.419 |
| 0.8229166666666666 | 25.419 |
| 0.8236111111111111 | 25.419 |
| 0.8243055555555556 | 25.419 |
| 0.8250000000000001 | 25.419 |
| 0.8256944444444444 | 21.024 |
| 0.8263888888888888 | 21.024 |
| 0.8270833333333334 | 21.024 |
| 0.8277777777777778 | 21.024 |
| 0.8284722222222222 | 16.636 |
| 0.8291666666666666 | 16.636 |
| 0.8298611111111112 | 12.257 |
| 0.8305555555555556 | 12.257 |
| 0.8312499999999999 | 12.257 |
| 0.8319444444444444 | 12.257 |
| 0.8326388888888889 | 12.257 |
| 0.8333333333333334 | 12.257 |
| 0.8340277777777777 | 12.257 |
| 0.8347222222222223 | 7.887 |
| 0.8354166666666667 | 12.257 |
| 0.8361111111111111 | 12.257 |
| 0.8368055555555555 | 12.257 |
| 0.8375 | 12.257 |
| 0.8381944444444445 | 12.257 |
| 0.8388888888888889 | 12.257 |
| 0.8395833333333332 | 7.887 |
| 0.8402777777777778 | 7.887 |
| 0.8409722222222222 | 7.887 |
| 0.8416666666666667 | 3.525 |
| 0.842361111111111 | 3.525 |
| 0.8430555555555556 | 3.525 |
| 0.84375 | 3.525 |
| 0.8444444444444444 | 3.525 |
| 0.845138888888889 | 0 |
| 0.8458333333333333 | 0 |
| 0.8465277777777778 | 0 |
| 0.8472222222222222 | 0 |
| 0.8479166666666668 | 0 |
| 0.8486111111111111 | 0 |
| 0.8493055555555555 | 0 |
| 0.85 | 0 |
| 0.8506944444444445 | 0 |
| 0.8513888888888889 | 0 |
| 0.8520833333333333 | 0 |
| 0.8527777777777777 | 0 |
| 0.8534722222222223 | 0 |
| 0.8541666666666666 | 0 |
| 0.8548611111111111 | 0 |
| 0.8555555555555556 | 0 |
| 0.8562500000000001 | 0 |
| 0.8569444444444444 | 0 |
| 0.8576388888888888 | 0 |
| 0.8583333333333334 | 0 |
| 0.8590277777777778 | 0 |
| 0.8597222222222222 | 0 |
| 0.8604166666666666 | 0 |
| 0.8611111111111112 | 0 |
| 0.8618055555555556 | 0 |
| 0.8624999999999999 | 0 |
| 0.8631944444444444 | 0 |
| 0.8638888888888889 | 0 |
| 0.8645833333333334 | 0 |
| 0.8652777777777777 | 0 |
| 0.8659722222222223 | 0 |
| 0.8666666666666667 | 0 |
| 0.8673611111111111 | 0 |
| 0.8680555555555555 | 0 |
| 0.86875 | 0 |
| 0.8694444444444445 | 0 |
| 0.8701388888888889 | 0 |
| 0.8708333333333332 | 0 |
| 0.8715277777777778 | 0 |
| 0.8722222222222222 | 0 |
| 0.8729166666666667 | 0 |
| 0.873611111111111 | 0 |
| 0.8743055555555556 | 0 |
| 0.875 | 0 |
| 0.8756944444444444 | 0 |
| 0.876388888888889 | 0 |
| 0.8770833333333333 | 0 |
| 0.8777777777777778 | 0 |
| 0.8784722222222222 | 0 |
| 0.8791666666666668 | 0 |
| 0.8798611111111111 | 0 |
| 0.8805555555555555 | 0 |
| 0.88125 | 0 |
| 0.8819444444444445 | 0 |
| 0.8826388888888889 | 0 |
| 0.8833333333333333 | 0 |
| 0.8840277777777777 | 0 |
| 0.8847222222222223 | 0 |
| 0.8854166666666666 | 0 |
| 0.8861111111111111 | 0 |
| 0.8868055555555556 | 0 |
| 0.8875000000000001 | 0 |
| 0.8881944444444444 | 0 |
| 0.8888888888888888 | 0 |
| 0.8895833333333334 | 0 |
| 0.8902777777777778 | 0 |
| 0.8909722222222222 | 0 |
| 0.8916666666666666 | 0 |
| 0.8923611111111112 | 0 |
| 0.8930555555555556 | 0 |
| 0.8937499999999999 | 0 |
| 0.8944444444444444 | 0 |
| 0.8951388888888889 | 0 |
| 0.8958333333333334 | 0 |
| 0.8965277777777777 | 0 |
| 0.8972222222222223 | 0 |
| 0.8979166666666667 | 0 |
| 0.8986111111111111 | 0 |
| 0.8993055555555555 | 0 |
| 0.9 | 0 |
| 0.9006944444444445 | 0 |
| 0.9013888888888889 | 0 |
| 0.9020833333333332 | 0 |
| 0.9027777777777778 | 0 |
| 0.9034722222222222 | 0 |
| 0.9041666666666667 | 0 |
| 0.904861111111111 | 0 |
| 0.9055555555555556 | 0 |
| 0.90625 | 0 |
| 0.9069444444444444 | 0 |
| 0.907638888888889 | 0 |
| 0.9083333333333333 | 0 |
| 0.9090277777777778 | 0 |
| 0.9097222222222222 | 0 |
| 0.9104166666666668 | 0 |
| 0.9111111111111111 | 0 |
| 0.9118055555555555 | 0 |
| 0.9125 | 0 |
| 0.9131944444444445 | 0 |
| 0.9138888888888889 | 0 |
| 0.9145833333333333 | 0 |
| 0.9152777777777777 | 0 |
| 0.9159722222222223 | 0 |
| 0.9166666666666666 | 0 |
| 0.9173611111111111 | 0 |
| 0.9180555555555556 | 0 |
| 0.9187500000000001 | 0 |
| 0.9194444444444444 | 0 |
| 0.9201388888888888 | 0 |
| 0.9208333333333334 | 0 |
| 0.9215277777777778 | 0 |
| 0.9222222222222222 | 0 |
| 0.9229166666666666 | 0 |
| 0.9236111111111112 | 0 |
| 0.9243055555555556 | 0 |
| 0.9249999999999999 | 0 |
| 0.9256944444444444 | 0 |
| 0.9263888888888889 | 0 |
| 0.9270833333333334 | 0 |
| 0.9277777777777777 | 0 |
| 0.9284722222222223 | 0 |
| 0.9291666666666667 | 0 |
| 0.9298611111111111 | 0 |
| 0.9305555555555555 | 0 |
| 0.93125 | 0 |
| 0.9319444444444445 | 0 |
| 0.9326388888888889 | 0 |
| 0.9333333333333332 | 0 |
| 0.9340277777777778 | 0 |
| 0.9347222222222222 | 0 |
| 0.9354166666666667 | 0 |
| 0.936111111111111 | 0 |
| 0.9368055555555556 | 0 |
| 0.9375 | 0 |
| 0.9381944444444444 | 0 |
| 0.938888888888889 | 0 |
| 0.9395833333333333 | 0 |
| 0.9402777777777778 | 0 |
| 0.9409722222222222 | 0 |
| 0.9416666666666668 | 0 |
| 0.9423611111111111 | 0 |
| 0.9430555555555555 | 0 |
| 0.94375 | 0 |
| 0.9444444444444445 | 0 |
| 0.9451388888888889 | 0 |
| 0.9458333333333333 | 0 |
| 0.9465277777777777 | 0 |
| 0.9472222222222223 | 0 |
| 0.9479166666666666 | 0 |
| 0.9486111111111111 | 0 |
| 0.9493055555555556 | 0 |
| 0.9500000000000001 | 0 |
| 0.9506944444444444 | 0 |
| 0.9513888888888888 | 0 |
| 0.9520833333333334 | 0 |
| 0.9527777777777778 | 0 |
| 0.9534722222222222 | 0 |
| 0.9541666666666666 | 0 |
| 0.9548611111111112 | 0 |
| 0.9555555555555556 | 0 |
| 0.9562499999999999 | 0 |
| 0.9569444444444444 | 0 |
| 0.9576388888888889 | 0 |
| 0.9583333333333334 | 0 |
| 0.9590277777777777 | 0 |
| 0.9597222222222223 | 0 |
| 0.9604166666666667 | 0 |
| 0.9611111111111111 | 0 |
| 0.9618055555555555 | 0 |
| 0.9625 | 0 |
| 0.9631944444444445 | 0 |
| 0.9638888888888889 | 0 |
| 0.9645833333333332 | 0 |
| 0.9652777777777778 | 0 |
| 0.9659722222222222 | 0 |
| 0.9666666666666667 | 0 |
| 0.967361111111111 | 0 |
| 0.9680555555555556 | 0 |
| 0.96875 | 0 |
| 0.9694444444444444 | 0 |
| 0.970138888888889 | 0 |
| 0.9708333333333333 | 0 |
| 0.9715277777777778 | 0 |
| 0.9722222222222222 | 0 |
| 0.9729166666666668 | 0 |
| 0.9736111111111111 | 0 |
| 0.9743055555555555 | 0 |
| 0.975 | 0 |
| 0.9756944444444445 | 0 |
| 0.9763888888888889 | 0 |
| 0.9770833333333333 | 0 |
| 0.9777777777777777 | 0 |
| 0.9784722222222223 | 0 |
| 0.9791666666666666 | 0 |
| 0.9798611111111111 | 0 |
| 0.9805555555555556 | 0 |
| 0.9812500000000001 | 0 |
| 0.9819444444444444 | 0 |
| 0.9826388888888888 | 0 |
| 0.9833333333333334 | 0 |
| 0.9840277777777778 | 0 |
| 0.9847222222222222 | 0 |
| 0.9854166666666666 | 0 |
| 0.9861111111111112 | 0 |
| 0.9868055555555556 | 0 |
| 0.9874999999999999 | 0 |
| 0.9881944444444444 | 0 |
| 0.9888888888888889 | 0 |
| 0.9895833333333334 | 0 |
| 0.9902777777777777 | 0 |
| 0.9909722222222223 | 0 |
| 0.9916666666666667 | 0 |
| 0.9923611111111111 | 0 |
| 0.9930555555555555 | 0 |
| 0.99375 | 0 |
| 0.9944444444444445 | 0 |
| 0.9951388888888889 | 0 |
| 0.9958333333333332 | 0 |
| 0.9965277777777778 | 0 |
| 0.9972222222222222 | 0 |
| 0.9979166666666667 | 0 |
| 0.998611111111111 | 0 |
| 0.9993055555555556 | 0 |